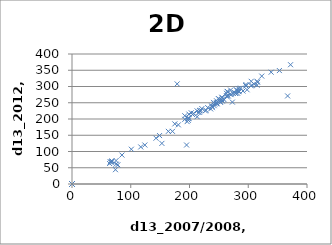
| Category | Series 0 |
|---|---|
| 255.0 | 259 |
| 263.0 | 279 |
| 271.0 | 275 |
| 269.0 | 276 |
| 251.0 | 261 |
| 315.0 | 304 |
| 249.0 | 263 |
| 253.0 | 251 |
| 316.0 | 313 |
| 255.0 | 267 |
| 265.0 | 284 |
| 175.0 | 185 |
| 310.0 | 307 |
| 296.0 | 306 |
| 246.0 | 250 |
| 283.0 | 294 |
| 323.0 | 332 |
| 298.0 | 290 |
| 278.0 | 279 |
| 252.0 | 254 |
| 284.0 | 286 |
| 247.0 | 247 |
| 281.0 | 287 |
| 277.0 | 281 |
| 256.0 | 265 |
| 287.0 | 295 |
| 315.0 | 316 |
| 242.0 | 241 |
| 305.0 | 302 |
| 238.0 | 239 |
| 296.0 | 302 |
| 259.0 | 259 |
| 205.0 | 214 |
| 198.0 | 201 |
| 367.0 | 271 |
| 246.0 | 256 |
| 372.0 | 367 |
| 339.0 | 344 |
| 243.0 | 246 |
| 231.0 | 235 |
| 217.0 | 226 |
| 306.0 | 304 |
| 273.0 | 252 |
| 241.0 | 251 |
| 239.0 | 235 |
| 263.0 | 270 |
| 238.0 | 240 |
| 291.0 | 286 |
| 0.0 | 0 |
| 199.0 | 202 |
| 221.0 | 232 |
| 217.0 | 221 |
| 236.0 | 231 |
| 228.0 | 227 |
| 264.0 | 271 |
| 181.0 | 182 |
| 179.0 | 308 |
| 207.0 | 217 |
| 296.0 | 302 |
| 353.0 | 349 |
| 117.0 | 114 |
| 282.0 | 279 |
| 192.0 | 210 |
| 213.0 | 225 |
| 199.0 | 215 |
| 227.0 | 225 |
| 305.0 | 316 |
| 270.0 | 289 |
| 0.0 | 0 |
| 264.0 | 285 |
| 192.0 | 199 |
| 203.0 | 219 |
| 198.0 | 203 |
| 216.0 | 220 |
| 280.0 | 290 |
| 274.0 | 279 |
| 256.0 | 255 |
| 266.0 | 271 |
| 0.0 | 0 |
| 213.0 | 207 |
| 246.0 | 247 |
| 171.0 | 162 |
| 67.0 | 69 |
| 75.0 | 61 |
| 101.0 | 107 |
| 65.0 | 68 |
| 85.0 | 89 |
| 74.0 | 44 |
| 64.0 | 63 |
| 78.0 | 59 |
| 75.0 | 72 |
| 67.0 | 67 |
| 68.0 | 71 |
| 0.0 | 0 |
| 196.0 | 192 |
| 279.0 | 279 |
| 164.0 | 162 |
| 198.0 | 196 |
| 284.0 | 284 |
| 149.0 | 149 |
| 153.0 | 125 |
| 219.0 | 227 |
| 195.0 | 120 |
| 124.0 | 120 |
| 143.0 | 141 |
| 0.0 | 0 |
| 0.0 | 0 |
| 0.0 | 0 |
| 0.0 | 0 |
| 0.0 | 0 |
| 0.0 | 0 |
| 0.0 | 0 |
| 0.0 | 0 |
| 0.0 | 0 |